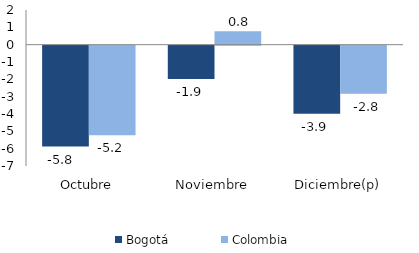
| Category | Bogotá | Colombia |
|---|---|---|
| Octubre | -5.821 | -5.175 |
| Noviembre | -1.919 | 0.769 |
| Diciembre(p) | -3.934 | -2.77 |